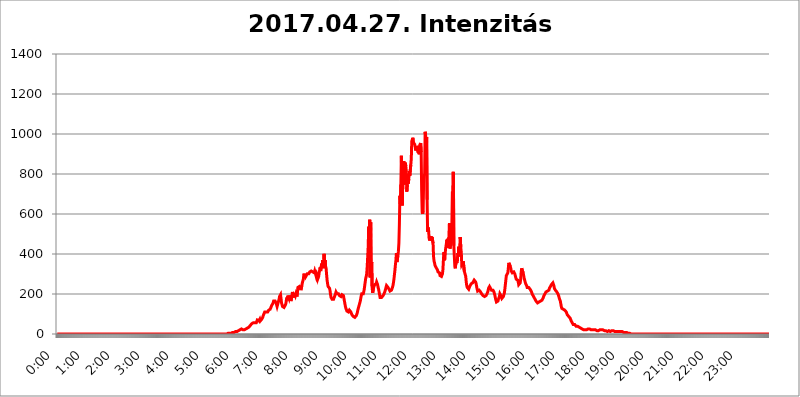
| Category | 2017.04.27. Intenzitás [W/m^2] |
|---|---|
| 0.0 | 0 |
| 0.0006944444444444445 | 0 |
| 0.001388888888888889 | 0 |
| 0.0020833333333333333 | 0 |
| 0.002777777777777778 | 0 |
| 0.003472222222222222 | 0 |
| 0.004166666666666667 | 0 |
| 0.004861111111111111 | 0 |
| 0.005555555555555556 | 0 |
| 0.0062499999999999995 | 0 |
| 0.006944444444444444 | 0 |
| 0.007638888888888889 | 0 |
| 0.008333333333333333 | 0 |
| 0.009027777777777779 | 0 |
| 0.009722222222222222 | 0 |
| 0.010416666666666666 | 0 |
| 0.011111111111111112 | 0 |
| 0.011805555555555555 | 0 |
| 0.012499999999999999 | 0 |
| 0.013194444444444444 | 0 |
| 0.013888888888888888 | 0 |
| 0.014583333333333332 | 0 |
| 0.015277777777777777 | 0 |
| 0.015972222222222224 | 0 |
| 0.016666666666666666 | 0 |
| 0.017361111111111112 | 0 |
| 0.018055555555555557 | 0 |
| 0.01875 | 0 |
| 0.019444444444444445 | 0 |
| 0.02013888888888889 | 0 |
| 0.020833333333333332 | 0 |
| 0.02152777777777778 | 0 |
| 0.022222222222222223 | 0 |
| 0.02291666666666667 | 0 |
| 0.02361111111111111 | 0 |
| 0.024305555555555556 | 0 |
| 0.024999999999999998 | 0 |
| 0.025694444444444447 | 0 |
| 0.02638888888888889 | 0 |
| 0.027083333333333334 | 0 |
| 0.027777777777777776 | 0 |
| 0.02847222222222222 | 0 |
| 0.029166666666666664 | 0 |
| 0.029861111111111113 | 0 |
| 0.030555555555555555 | 0 |
| 0.03125 | 0 |
| 0.03194444444444445 | 0 |
| 0.03263888888888889 | 0 |
| 0.03333333333333333 | 0 |
| 0.034027777777777775 | 0 |
| 0.034722222222222224 | 0 |
| 0.035416666666666666 | 0 |
| 0.036111111111111115 | 0 |
| 0.03680555555555556 | 0 |
| 0.0375 | 0 |
| 0.03819444444444444 | 0 |
| 0.03888888888888889 | 0 |
| 0.03958333333333333 | 0 |
| 0.04027777777777778 | 0 |
| 0.04097222222222222 | 0 |
| 0.041666666666666664 | 0 |
| 0.042361111111111106 | 0 |
| 0.04305555555555556 | 0 |
| 0.043750000000000004 | 0 |
| 0.044444444444444446 | 0 |
| 0.04513888888888889 | 0 |
| 0.04583333333333334 | 0 |
| 0.04652777777777778 | 0 |
| 0.04722222222222222 | 0 |
| 0.04791666666666666 | 0 |
| 0.04861111111111111 | 0 |
| 0.049305555555555554 | 0 |
| 0.049999999999999996 | 0 |
| 0.05069444444444445 | 0 |
| 0.051388888888888894 | 0 |
| 0.052083333333333336 | 0 |
| 0.05277777777777778 | 0 |
| 0.05347222222222222 | 0 |
| 0.05416666666666667 | 0 |
| 0.05486111111111111 | 0 |
| 0.05555555555555555 | 0 |
| 0.05625 | 0 |
| 0.05694444444444444 | 0 |
| 0.057638888888888885 | 0 |
| 0.05833333333333333 | 0 |
| 0.05902777777777778 | 0 |
| 0.059722222222222225 | 0 |
| 0.06041666666666667 | 0 |
| 0.061111111111111116 | 0 |
| 0.06180555555555556 | 0 |
| 0.0625 | 0 |
| 0.06319444444444444 | 0 |
| 0.06388888888888888 | 0 |
| 0.06458333333333334 | 0 |
| 0.06527777777777778 | 0 |
| 0.06597222222222222 | 0 |
| 0.06666666666666667 | 0 |
| 0.06736111111111111 | 0 |
| 0.06805555555555555 | 0 |
| 0.06874999999999999 | 0 |
| 0.06944444444444443 | 0 |
| 0.07013888888888889 | 0 |
| 0.07083333333333333 | 0 |
| 0.07152777777777779 | 0 |
| 0.07222222222222223 | 0 |
| 0.07291666666666667 | 0 |
| 0.07361111111111111 | 0 |
| 0.07430555555555556 | 0 |
| 0.075 | 0 |
| 0.07569444444444444 | 0 |
| 0.0763888888888889 | 0 |
| 0.07708333333333334 | 0 |
| 0.07777777777777778 | 0 |
| 0.07847222222222222 | 0 |
| 0.07916666666666666 | 0 |
| 0.0798611111111111 | 0 |
| 0.08055555555555556 | 0 |
| 0.08125 | 0 |
| 0.08194444444444444 | 0 |
| 0.08263888888888889 | 0 |
| 0.08333333333333333 | 0 |
| 0.08402777777777777 | 0 |
| 0.08472222222222221 | 0 |
| 0.08541666666666665 | 0 |
| 0.08611111111111112 | 0 |
| 0.08680555555555557 | 0 |
| 0.08750000000000001 | 0 |
| 0.08819444444444445 | 0 |
| 0.08888888888888889 | 0 |
| 0.08958333333333333 | 0 |
| 0.09027777777777778 | 0 |
| 0.09097222222222222 | 0 |
| 0.09166666666666667 | 0 |
| 0.09236111111111112 | 0 |
| 0.09305555555555556 | 0 |
| 0.09375 | 0 |
| 0.09444444444444444 | 0 |
| 0.09513888888888888 | 0 |
| 0.09583333333333333 | 0 |
| 0.09652777777777777 | 0 |
| 0.09722222222222222 | 0 |
| 0.09791666666666667 | 0 |
| 0.09861111111111111 | 0 |
| 0.09930555555555555 | 0 |
| 0.09999999999999999 | 0 |
| 0.10069444444444443 | 0 |
| 0.1013888888888889 | 0 |
| 0.10208333333333335 | 0 |
| 0.10277777777777779 | 0 |
| 0.10347222222222223 | 0 |
| 0.10416666666666667 | 0 |
| 0.10486111111111111 | 0 |
| 0.10555555555555556 | 0 |
| 0.10625 | 0 |
| 0.10694444444444444 | 0 |
| 0.1076388888888889 | 0 |
| 0.10833333333333334 | 0 |
| 0.10902777777777778 | 0 |
| 0.10972222222222222 | 0 |
| 0.1111111111111111 | 0 |
| 0.11180555555555556 | 0 |
| 0.11180555555555556 | 0 |
| 0.1125 | 0 |
| 0.11319444444444444 | 0 |
| 0.11388888888888889 | 0 |
| 0.11458333333333333 | 0 |
| 0.11527777777777777 | 0 |
| 0.11597222222222221 | 0 |
| 0.11666666666666665 | 0 |
| 0.1173611111111111 | 0 |
| 0.11805555555555557 | 0 |
| 0.11944444444444445 | 0 |
| 0.12013888888888889 | 0 |
| 0.12083333333333333 | 0 |
| 0.12152777777777778 | 0 |
| 0.12222222222222223 | 0 |
| 0.12291666666666667 | 0 |
| 0.12291666666666667 | 0 |
| 0.12361111111111112 | 0 |
| 0.12430555555555556 | 0 |
| 0.125 | 0 |
| 0.12569444444444444 | 0 |
| 0.12638888888888888 | 0 |
| 0.12708333333333333 | 0 |
| 0.16875 | 0 |
| 0.12847222222222224 | 0 |
| 0.12916666666666668 | 0 |
| 0.12986111111111112 | 0 |
| 0.13055555555555556 | 0 |
| 0.13125 | 0 |
| 0.13194444444444445 | 0 |
| 0.1326388888888889 | 0 |
| 0.13333333333333333 | 0 |
| 0.13402777777777777 | 0 |
| 0.13402777777777777 | 0 |
| 0.13472222222222222 | 0 |
| 0.13541666666666666 | 0 |
| 0.1361111111111111 | 0 |
| 0.13749999999999998 | 0 |
| 0.13819444444444443 | 0 |
| 0.1388888888888889 | 0 |
| 0.13958333333333334 | 0 |
| 0.14027777777777778 | 0 |
| 0.14097222222222222 | 0 |
| 0.14166666666666666 | 0 |
| 0.1423611111111111 | 0 |
| 0.14305555555555557 | 0 |
| 0.14375000000000002 | 0 |
| 0.14444444444444446 | 0 |
| 0.1451388888888889 | 0 |
| 0.1451388888888889 | 0 |
| 0.14652777777777778 | 0 |
| 0.14722222222222223 | 0 |
| 0.14791666666666667 | 0 |
| 0.1486111111111111 | 0 |
| 0.14930555555555555 | 0 |
| 0.15 | 0 |
| 0.15069444444444444 | 0 |
| 0.15138888888888888 | 0 |
| 0.15208333333333332 | 0 |
| 0.15277777777777776 | 0 |
| 0.15347222222222223 | 0 |
| 0.15416666666666667 | 0 |
| 0.15486111111111112 | 0 |
| 0.15555555555555556 | 0 |
| 0.15625 | 0 |
| 0.15694444444444444 | 0 |
| 0.15763888888888888 | 0 |
| 0.15833333333333333 | 0 |
| 0.15902777777777777 | 0 |
| 0.15972222222222224 | 0 |
| 0.16041666666666668 | 0 |
| 0.16111111111111112 | 0 |
| 0.16180555555555556 | 0 |
| 0.1625 | 0 |
| 0.16319444444444445 | 0 |
| 0.1638888888888889 | 0 |
| 0.16458333333333333 | 0 |
| 0.16527777777777777 | 0 |
| 0.16597222222222222 | 0 |
| 0.16666666666666666 | 0 |
| 0.1673611111111111 | 0 |
| 0.16805555555555554 | 0 |
| 0.16874999999999998 | 0 |
| 0.16944444444444443 | 0 |
| 0.17013888888888887 | 0 |
| 0.1708333333333333 | 0 |
| 0.17152777777777775 | 0 |
| 0.17222222222222225 | 0 |
| 0.1729166666666667 | 0 |
| 0.17361111111111113 | 0 |
| 0.17430555555555557 | 0 |
| 0.17500000000000002 | 0 |
| 0.17569444444444446 | 0 |
| 0.1763888888888889 | 0 |
| 0.17708333333333334 | 0 |
| 0.17777777777777778 | 0 |
| 0.17847222222222223 | 0 |
| 0.17916666666666667 | 0 |
| 0.1798611111111111 | 0 |
| 0.18055555555555555 | 0 |
| 0.18125 | 0 |
| 0.18194444444444444 | 0 |
| 0.1826388888888889 | 0 |
| 0.18333333333333335 | 0 |
| 0.1840277777777778 | 0 |
| 0.18472222222222223 | 0 |
| 0.18541666666666667 | 0 |
| 0.18611111111111112 | 0 |
| 0.18680555555555556 | 0 |
| 0.1875 | 0 |
| 0.18819444444444444 | 0 |
| 0.18888888888888888 | 0 |
| 0.18958333333333333 | 0 |
| 0.19027777777777777 | 0 |
| 0.1909722222222222 | 0 |
| 0.19166666666666665 | 0 |
| 0.19236111111111112 | 0 |
| 0.19305555555555554 | 0 |
| 0.19375 | 0 |
| 0.19444444444444445 | 0 |
| 0.1951388888888889 | 0 |
| 0.19583333333333333 | 0 |
| 0.19652777777777777 | 0 |
| 0.19722222222222222 | 0 |
| 0.19791666666666666 | 0 |
| 0.1986111111111111 | 0 |
| 0.19930555555555554 | 0 |
| 0.19999999999999998 | 0 |
| 0.20069444444444443 | 0 |
| 0.20138888888888887 | 0 |
| 0.2020833333333333 | 0 |
| 0.2027777777777778 | 0 |
| 0.2034722222222222 | 0 |
| 0.2041666666666667 | 0 |
| 0.20486111111111113 | 0 |
| 0.20555555555555557 | 0 |
| 0.20625000000000002 | 0 |
| 0.20694444444444446 | 0 |
| 0.2076388888888889 | 0 |
| 0.20833333333333334 | 0 |
| 0.20902777777777778 | 0 |
| 0.20972222222222223 | 0 |
| 0.21041666666666667 | 0 |
| 0.2111111111111111 | 0 |
| 0.21180555555555555 | 0 |
| 0.2125 | 0 |
| 0.21319444444444444 | 0 |
| 0.2138888888888889 | 0 |
| 0.21458333333333335 | 0 |
| 0.2152777777777778 | 0 |
| 0.21597222222222223 | 0 |
| 0.21666666666666667 | 0 |
| 0.21736111111111112 | 0 |
| 0.21805555555555556 | 0 |
| 0.21875 | 0 |
| 0.21944444444444444 | 0 |
| 0.22013888888888888 | 0 |
| 0.22083333333333333 | 0 |
| 0.22152777777777777 | 0 |
| 0.2222222222222222 | 0 |
| 0.22291666666666665 | 0 |
| 0.2236111111111111 | 0 |
| 0.22430555555555556 | 0 |
| 0.225 | 0 |
| 0.22569444444444445 | 0 |
| 0.2263888888888889 | 0 |
| 0.22708333333333333 | 0 |
| 0.22777777777777777 | 0 |
| 0.22847222222222222 | 0 |
| 0.22916666666666666 | 0 |
| 0.2298611111111111 | 0 |
| 0.23055555555555554 | 0 |
| 0.23124999999999998 | 0 |
| 0.23194444444444443 | 0 |
| 0.23263888888888887 | 0 |
| 0.2333333333333333 | 0 |
| 0.2340277777777778 | 0 |
| 0.2347222222222222 | 0 |
| 0.2354166666666667 | 0 |
| 0.23611111111111113 | 0 |
| 0.23680555555555557 | 0 |
| 0.23750000000000002 | 0 |
| 0.23819444444444446 | 3.525 |
| 0.2388888888888889 | 3.525 |
| 0.23958333333333334 | 3.525 |
| 0.24027777777777778 | 3.525 |
| 0.24097222222222223 | 3.525 |
| 0.24166666666666667 | 3.525 |
| 0.2423611111111111 | 3.525 |
| 0.24305555555555555 | 3.525 |
| 0.24375 | 3.525 |
| 0.24444444444444446 | 3.525 |
| 0.24513888888888888 | 7.887 |
| 0.24583333333333335 | 7.887 |
| 0.2465277777777778 | 7.887 |
| 0.24722222222222223 | 7.887 |
| 0.24791666666666667 | 7.887 |
| 0.24861111111111112 | 7.887 |
| 0.24930555555555556 | 12.257 |
| 0.25 | 12.257 |
| 0.25069444444444444 | 12.257 |
| 0.2513888888888889 | 12.257 |
| 0.2520833333333333 | 12.257 |
| 0.25277777777777777 | 12.257 |
| 0.2534722222222222 | 16.636 |
| 0.25416666666666665 | 16.636 |
| 0.2548611111111111 | 21.024 |
| 0.2555555555555556 | 21.024 |
| 0.25625000000000003 | 21.024 |
| 0.2569444444444445 | 25.419 |
| 0.2576388888888889 | 25.419 |
| 0.25833333333333336 | 25.419 |
| 0.2590277777777778 | 25.419 |
| 0.25972222222222224 | 21.024 |
| 0.2604166666666667 | 21.024 |
| 0.2611111111111111 | 21.024 |
| 0.26180555555555557 | 21.024 |
| 0.2625 | 21.024 |
| 0.26319444444444445 | 25.419 |
| 0.2638888888888889 | 25.419 |
| 0.26458333333333334 | 25.419 |
| 0.2652777777777778 | 25.419 |
| 0.2659722222222222 | 29.823 |
| 0.26666666666666666 | 29.823 |
| 0.2673611111111111 | 29.823 |
| 0.26805555555555555 | 34.234 |
| 0.26875 | 34.234 |
| 0.26944444444444443 | 38.653 |
| 0.2701388888888889 | 38.653 |
| 0.2708333333333333 | 43.079 |
| 0.27152777777777776 | 47.511 |
| 0.2722222222222222 | 47.511 |
| 0.27291666666666664 | 51.951 |
| 0.2736111111111111 | 56.398 |
| 0.2743055555555555 | 56.398 |
| 0.27499999999999997 | 56.398 |
| 0.27569444444444446 | 56.398 |
| 0.27638888888888885 | 56.398 |
| 0.27708333333333335 | 56.398 |
| 0.2777777777777778 | 56.398 |
| 0.27847222222222223 | 56.398 |
| 0.2791666666666667 | 56.398 |
| 0.2798611111111111 | 56.398 |
| 0.28055555555555556 | 69.775 |
| 0.28125 | 69.775 |
| 0.28194444444444444 | 74.246 |
| 0.2826388888888889 | 65.31 |
| 0.2833333333333333 | 69.775 |
| 0.28402777777777777 | 74.246 |
| 0.2847222222222222 | 65.31 |
| 0.28541666666666665 | 69.775 |
| 0.28611111111111115 | 69.775 |
| 0.28680555555555554 | 74.246 |
| 0.28750000000000003 | 78.722 |
| 0.2881944444444445 | 83.205 |
| 0.2888888888888889 | 92.184 |
| 0.28958333333333336 | 92.184 |
| 0.2902777777777778 | 92.184 |
| 0.29097222222222224 | 110.201 |
| 0.2916666666666667 | 110.201 |
| 0.2923611111111111 | 110.201 |
| 0.29305555555555557 | 110.201 |
| 0.29375 | 114.716 |
| 0.29444444444444445 | 114.716 |
| 0.2951388888888889 | 110.201 |
| 0.29583333333333334 | 114.716 |
| 0.2965277777777778 | 119.235 |
| 0.2972222222222222 | 119.235 |
| 0.29791666666666666 | 119.235 |
| 0.2986111111111111 | 123.758 |
| 0.29930555555555555 | 128.284 |
| 0.3 | 128.284 |
| 0.30069444444444443 | 141.884 |
| 0.3013888888888889 | 146.423 |
| 0.3020833333333333 | 146.423 |
| 0.30277777777777776 | 155.509 |
| 0.3034722222222222 | 164.605 |
| 0.30416666666666664 | 169.156 |
| 0.3048611111111111 | 160.056 |
| 0.3055555555555555 | 164.605 |
| 0.30624999999999997 | 160.056 |
| 0.3069444444444444 | 155.509 |
| 0.3076388888888889 | 150.964 |
| 0.30833333333333335 | 137.347 |
| 0.3090277777777778 | 141.884 |
| 0.30972222222222223 | 155.509 |
| 0.3104166666666667 | 164.605 |
| 0.3111111111111111 | 173.709 |
| 0.31180555555555556 | 187.378 |
| 0.3125 | 182.82 |
| 0.31319444444444444 | 196.497 |
| 0.3138888888888889 | 191.937 |
| 0.3145833333333333 | 155.509 |
| 0.31527777777777777 | 146.423 |
| 0.3159722222222222 | 137.347 |
| 0.31666666666666665 | 132.814 |
| 0.31736111111111115 | 132.814 |
| 0.31805555555555554 | 132.814 |
| 0.31875000000000003 | 137.347 |
| 0.3194444444444445 | 137.347 |
| 0.3201388888888889 | 146.423 |
| 0.32083333333333336 | 155.509 |
| 0.3215277777777778 | 173.709 |
| 0.32222222222222224 | 182.82 |
| 0.3229166666666667 | 169.156 |
| 0.3236111111111111 | 191.937 |
| 0.32430555555555557 | 187.378 |
| 0.325 | 178.264 |
| 0.32569444444444445 | 191.937 |
| 0.3263888888888889 | 182.82 |
| 0.32708333333333334 | 178.264 |
| 0.3277777777777778 | 164.605 |
| 0.3284722222222222 | 169.156 |
| 0.32916666666666666 | 191.937 |
| 0.3298611111111111 | 210.182 |
| 0.33055555555555555 | 210.182 |
| 0.33125 | 210.182 |
| 0.33194444444444443 | 182.82 |
| 0.3326388888888889 | 205.62 |
| 0.3333333333333333 | 201.058 |
| 0.3340277777777778 | 191.937 |
| 0.3347222222222222 | 201.058 |
| 0.3354166666666667 | 201.058 |
| 0.3361111111111111 | 187.378 |
| 0.3368055555555556 | 210.182 |
| 0.33749999999999997 | 233 |
| 0.33819444444444446 | 233 |
| 0.33888888888888885 | 237.564 |
| 0.33958333333333335 | 237.564 |
| 0.34027777777777773 | 237.564 |
| 0.34097222222222223 | 228.436 |
| 0.3416666666666666 | 219.309 |
| 0.3423611111111111 | 223.873 |
| 0.3430555555555555 | 242.127 |
| 0.34375 | 255.813 |
| 0.3444444444444445 | 264.932 |
| 0.3451388888888889 | 274.047 |
| 0.3458333333333334 | 296.808 |
| 0.34652777777777777 | 301.354 |
| 0.34722222222222227 | 296.808 |
| 0.34791666666666665 | 296.808 |
| 0.34861111111111115 | 287.709 |
| 0.34930555555555554 | 287.709 |
| 0.35000000000000003 | 292.259 |
| 0.3506944444444444 | 301.354 |
| 0.3513888888888889 | 301.354 |
| 0.3520833333333333 | 296.808 |
| 0.3527777777777778 | 301.354 |
| 0.3534722222222222 | 305.898 |
| 0.3541666666666667 | 310.44 |
| 0.3548611111111111 | 310.44 |
| 0.35555555555555557 | 314.98 |
| 0.35625 | 314.98 |
| 0.35694444444444445 | 310.44 |
| 0.3576388888888889 | 319.517 |
| 0.35833333333333334 | 310.44 |
| 0.3590277777777778 | 305.898 |
| 0.3597222222222222 | 310.44 |
| 0.36041666666666666 | 305.898 |
| 0.3611111111111111 | 314.98 |
| 0.36180555555555555 | 314.98 |
| 0.3625 | 314.98 |
| 0.36319444444444443 | 287.709 |
| 0.3638888888888889 | 296.808 |
| 0.3645833333333333 | 287.709 |
| 0.3652777777777778 | 274.047 |
| 0.3659722222222222 | 269.49 |
| 0.3666666666666667 | 287.709 |
| 0.3673611111111111 | 305.898 |
| 0.3680555555555556 | 310.44 |
| 0.36874999999999997 | 333.113 |
| 0.36944444444444446 | 314.98 |
| 0.37013888888888885 | 310.44 |
| 0.37083333333333335 | 351.198 |
| 0.37152777777777773 | 342.162 |
| 0.37222222222222223 | 369.23 |
| 0.3729166666666666 | 351.198 |
| 0.3736111111111111 | 328.584 |
| 0.3743055555555555 | 400.638 |
| 0.375 | 351.198 |
| 0.3756944444444445 | 369.23 |
| 0.3763888888888889 | 337.639 |
| 0.3770833333333334 | 328.584 |
| 0.37777777777777777 | 296.808 |
| 0.37847222222222227 | 269.49 |
| 0.37916666666666665 | 251.251 |
| 0.37986111111111115 | 237.564 |
| 0.38055555555555554 | 233 |
| 0.38125000000000003 | 233 |
| 0.3819444444444444 | 228.436 |
| 0.3826388888888889 | 214.746 |
| 0.3833333333333333 | 196.497 |
| 0.3840277777777778 | 182.82 |
| 0.3847222222222222 | 178.264 |
| 0.3854166666666667 | 173.709 |
| 0.3861111111111111 | 178.264 |
| 0.38680555555555557 | 178.264 |
| 0.3875 | 173.709 |
| 0.38819444444444445 | 178.264 |
| 0.3888888888888889 | 187.378 |
| 0.38958333333333334 | 191.937 |
| 0.3902777777777778 | 201.058 |
| 0.3909722222222222 | 210.182 |
| 0.39166666666666666 | 210.182 |
| 0.3923611111111111 | 201.058 |
| 0.39305555555555555 | 196.497 |
| 0.39375 | 196.497 |
| 0.39444444444444443 | 201.058 |
| 0.3951388888888889 | 201.058 |
| 0.3958333333333333 | 191.937 |
| 0.3965277777777778 | 187.378 |
| 0.3972222222222222 | 187.378 |
| 0.3979166666666667 | 187.378 |
| 0.3986111111111111 | 191.937 |
| 0.3993055555555556 | 196.497 |
| 0.39999999999999997 | 201.058 |
| 0.40069444444444446 | 196.497 |
| 0.40138888888888885 | 191.937 |
| 0.40208333333333335 | 178.264 |
| 0.40277777777777773 | 164.605 |
| 0.40347222222222223 | 150.964 |
| 0.4041666666666666 | 137.347 |
| 0.4048611111111111 | 128.284 |
| 0.4055555555555555 | 123.758 |
| 0.40625 | 114.716 |
| 0.4069444444444445 | 110.201 |
| 0.4076388888888889 | 110.201 |
| 0.4083333333333334 | 110.201 |
| 0.40902777777777777 | 114.716 |
| 0.40972222222222227 | 119.235 |
| 0.41041666666666665 | 123.758 |
| 0.41111111111111115 | 119.235 |
| 0.41180555555555554 | 110.201 |
| 0.41250000000000003 | 105.69 |
| 0.4131944444444444 | 96.682 |
| 0.4138888888888889 | 96.682 |
| 0.4145833333333333 | 92.184 |
| 0.4152777777777778 | 87.692 |
| 0.4159722222222222 | 87.692 |
| 0.4166666666666667 | 83.205 |
| 0.4173611111111111 | 83.205 |
| 0.41805555555555557 | 83.205 |
| 0.41875 | 87.692 |
| 0.41944444444444445 | 92.184 |
| 0.4201388888888889 | 96.682 |
| 0.42083333333333334 | 105.69 |
| 0.4215277777777778 | 119.235 |
| 0.4222222222222222 | 128.284 |
| 0.42291666666666666 | 137.347 |
| 0.4236111111111111 | 146.423 |
| 0.42430555555555555 | 155.509 |
| 0.425 | 164.605 |
| 0.42569444444444443 | 178.264 |
| 0.4263888888888889 | 191.937 |
| 0.4270833333333333 | 201.058 |
| 0.4277777777777778 | 201.058 |
| 0.4284722222222222 | 196.497 |
| 0.4291666666666667 | 201.058 |
| 0.4298611111111111 | 210.182 |
| 0.4305555555555556 | 223.873 |
| 0.43124999999999997 | 242.127 |
| 0.43194444444444446 | 260.373 |
| 0.43263888888888885 | 278.603 |
| 0.43333333333333335 | 287.709 |
| 0.43402777777777773 | 301.354 |
| 0.43472222222222223 | 337.639 |
| 0.4354166666666666 | 333.113 |
| 0.4361111111111111 | 436.27 |
| 0.4368055555555555 | 536.82 |
| 0.4375 | 414.035 |
| 0.4381944444444445 | 571.049 |
| 0.4388888888888889 | 283.156 |
| 0.4395833333333334 | 558.261 |
| 0.44027777777777777 | 314.98 |
| 0.44097222222222227 | 360.221 |
| 0.44166666666666665 | 233 |
| 0.44236111111111115 | 205.62 |
| 0.44305555555555554 | 210.182 |
| 0.44375000000000003 | 233 |
| 0.4444444444444444 | 233 |
| 0.4451388888888889 | 246.689 |
| 0.4458333333333333 | 251.251 |
| 0.4465277777777778 | 246.689 |
| 0.4472222222222222 | 251.251 |
| 0.4479166666666667 | 260.373 |
| 0.4486111111111111 | 260.373 |
| 0.44930555555555557 | 246.689 |
| 0.45 | 233 |
| 0.45069444444444445 | 223.873 |
| 0.4513888888888889 | 210.182 |
| 0.45208333333333334 | 196.497 |
| 0.4527777777777778 | 182.82 |
| 0.4534722222222222 | 182.82 |
| 0.45416666666666666 | 182.82 |
| 0.4548611111111111 | 182.82 |
| 0.45555555555555555 | 187.378 |
| 0.45625 | 187.378 |
| 0.45694444444444443 | 191.937 |
| 0.4576388888888889 | 196.497 |
| 0.4583333333333333 | 201.058 |
| 0.4590277777777778 | 205.62 |
| 0.4597222222222222 | 214.746 |
| 0.4604166666666667 | 219.309 |
| 0.4611111111111111 | 233 |
| 0.4618055555555556 | 242.127 |
| 0.46249999999999997 | 242.127 |
| 0.46319444444444446 | 237.564 |
| 0.46388888888888885 | 233 |
| 0.46458333333333335 | 228.436 |
| 0.46527777777777773 | 223.873 |
| 0.46597222222222223 | 219.309 |
| 0.4666666666666666 | 214.746 |
| 0.4673611111111111 | 214.746 |
| 0.4680555555555555 | 214.746 |
| 0.46875 | 219.309 |
| 0.4694444444444445 | 223.873 |
| 0.4701388888888889 | 233 |
| 0.4708333333333334 | 242.127 |
| 0.47152777777777777 | 255.813 |
| 0.47222222222222227 | 274.047 |
| 0.47291666666666665 | 296.808 |
| 0.47361111111111115 | 319.517 |
| 0.47430555555555554 | 346.682 |
| 0.47500000000000003 | 369.23 |
| 0.4756944444444444 | 405.108 |
| 0.4763888888888889 | 360.221 |
| 0.4770833333333333 | 364.728 |
| 0.4777777777777778 | 391.685 |
| 0.4784722222222222 | 414.035 |
| 0.4791666666666667 | 453.968 |
| 0.4798611111111111 | 549.704 |
| 0.48055555555555557 | 691.608 |
| 0.48125 | 650.667 |
| 0.48194444444444445 | 747.834 |
| 0.4826388888888889 | 891.099 |
| 0.48333333333333334 | 723.889 |
| 0.4840277777777778 | 642.4 |
| 0.4847222222222222 | 791.169 |
| 0.48541666666666666 | 751.803 |
| 0.4861111111111111 | 864.493 |
| 0.48680555555555555 | 747.834 |
| 0.4875 | 841.526 |
| 0.48819444444444443 | 856.855 |
| 0.4888888888888889 | 837.682 |
| 0.4895833333333333 | 814.519 |
| 0.4902777777777778 | 711.832 |
| 0.4909722222222222 | 747.834 |
| 0.4916666666666667 | 767.62 |
| 0.4923611111111111 | 751.803 |
| 0.4930555555555556 | 775.492 |
| 0.49374999999999997 | 814.519 |
| 0.49444444444444446 | 791.169 |
| 0.49513888888888885 | 791.169 |
| 0.49583333333333335 | 845.365 |
| 0.49652777777777773 | 875.918 |
| 0.49722222222222223 | 962.555 |
| 0.4979166666666666 | 962.555 |
| 0.4986111111111111 | 981.244 |
| 0.4993055555555555 | 966.295 |
| 0.5 | 955.071 |
| 0.5006944444444444 | 951.327 |
| 0.5013888888888889 | 947.58 |
| 0.5020833333333333 | 947.58 |
| 0.5027777777777778 | 917.534 |
| 0.5034722222222222 | 940.082 |
| 0.5041666666666667 | 943.832 |
| 0.5048611111111111 | 943.832 |
| 0.5055555555555555 | 917.534 |
| 0.50625 | 906.223 |
| 0.5069444444444444 | 928.819 |
| 0.5076388888888889 | 898.668 |
| 0.5083333333333333 | 943.832 |
| 0.5090277777777777 | 940.082 |
| 0.5097222222222222 | 955.071 |
| 0.5104166666666666 | 909.996 |
| 0.5111111111111112 | 715.858 |
| 0.5118055555555555 | 609.062 |
| 0.5125000000000001 | 600.661 |
| 0.5131944444444444 | 617.436 |
| 0.513888888888889 | 771.559 |
| 0.5145833333333333 | 791.169 |
| 0.5152777777777778 | 798.974 |
| 0.5159722222222222 | 1011.118 |
| 0.5166666666666667 | 992.448 |
| 0.517361111111111 | 829.981 |
| 0.5180555555555556 | 984.98 |
| 0.5187499999999999 | 671.22 |
| 0.5194444444444445 | 510.885 |
| 0.5201388888888888 | 532.513 |
| 0.5208333333333334 | 519.555 |
| 0.5215277777777778 | 480.356 |
| 0.5222222222222223 | 467.187 |
| 0.5229166666666667 | 475.972 |
| 0.5236111111111111 | 480.356 |
| 0.5243055555555556 | 489.108 |
| 0.525 | 471.582 |
| 0.5256944444444445 | 484.735 |
| 0.5263888888888889 | 480.356 |
| 0.5270833333333333 | 453.968 |
| 0.5277777777777778 | 387.202 |
| 0.5284722222222222 | 364.728 |
| 0.5291666666666667 | 355.712 |
| 0.5298611111111111 | 342.162 |
| 0.5305555555555556 | 337.639 |
| 0.53125 | 333.113 |
| 0.5319444444444444 | 328.584 |
| 0.5326388888888889 | 333.113 |
| 0.5333333333333333 | 319.517 |
| 0.5340277777777778 | 310.44 |
| 0.5347222222222222 | 305.898 |
| 0.5354166666666667 | 305.898 |
| 0.5361111111111111 | 305.898 |
| 0.5368055555555555 | 292.259 |
| 0.5375 | 287.709 |
| 0.5381944444444444 | 287.709 |
| 0.5388888888888889 | 287.709 |
| 0.5395833333333333 | 287.709 |
| 0.5402777777777777 | 301.354 |
| 0.5409722222222222 | 324.052 |
| 0.5416666666666666 | 373.729 |
| 0.5423611111111112 | 409.574 |
| 0.5430555555555555 | 369.23 |
| 0.5437500000000001 | 378.224 |
| 0.5444444444444444 | 418.492 |
| 0.545138888888889 | 418.492 |
| 0.5458333333333333 | 422.943 |
| 0.5465277777777778 | 471.582 |
| 0.5472222222222222 | 445.129 |
| 0.5479166666666667 | 475.972 |
| 0.548611111111111 | 431.833 |
| 0.5493055555555556 | 484.735 |
| 0.5499999999999999 | 553.986 |
| 0.5506944444444445 | 427.39 |
| 0.5513888888888888 | 422.943 |
| 0.5520833333333334 | 427.39 |
| 0.5527777777777778 | 462.786 |
| 0.5534722222222223 | 549.704 |
| 0.5541666666666667 | 711.832 |
| 0.5548611111111111 | 663.019 |
| 0.5555555555555556 | 810.641 |
| 0.55625 | 440.702 |
| 0.5569444444444445 | 387.202 |
| 0.5576388888888889 | 337.639 |
| 0.5583333333333333 | 328.584 |
| 0.5590277777777778 | 355.712 |
| 0.5597222222222222 | 355.712 |
| 0.5604166666666667 | 351.198 |
| 0.5611111111111111 | 360.221 |
| 0.5618055555555556 | 405.108 |
| 0.5625 | 391.685 |
| 0.5631944444444444 | 436.27 |
| 0.5638888888888889 | 405.108 |
| 0.5645833333333333 | 387.202 |
| 0.5652777777777778 | 484.735 |
| 0.5659722222222222 | 431.833 |
| 0.5666666666666667 | 409.574 |
| 0.5673611111111111 | 346.682 |
| 0.5680555555555555 | 342.162 |
| 0.56875 | 355.712 |
| 0.5694444444444444 | 364.728 |
| 0.5701388888888889 | 369.23 |
| 0.5708333333333333 | 314.98 |
| 0.5715277777777777 | 319.517 |
| 0.5722222222222222 | 319.517 |
| 0.5729166666666666 | 287.709 |
| 0.5736111111111112 | 260.373 |
| 0.5743055555555555 | 242.127 |
| 0.5750000000000001 | 233 |
| 0.5756944444444444 | 228.436 |
| 0.576388888888889 | 228.436 |
| 0.5770833333333333 | 223.873 |
| 0.5777777777777778 | 228.436 |
| 0.5784722222222222 | 237.564 |
| 0.5791666666666667 | 242.127 |
| 0.579861111111111 | 242.127 |
| 0.5805555555555556 | 251.251 |
| 0.5812499999999999 | 255.813 |
| 0.5819444444444445 | 255.813 |
| 0.5826388888888888 | 255.813 |
| 0.5833333333333334 | 260.373 |
| 0.5840277777777778 | 260.373 |
| 0.5847222222222223 | 269.49 |
| 0.5854166666666667 | 269.49 |
| 0.5861111111111111 | 264.932 |
| 0.5868055555555556 | 260.373 |
| 0.5875 | 251.251 |
| 0.5881944444444445 | 237.564 |
| 0.5888888888888889 | 223.873 |
| 0.5895833333333333 | 214.746 |
| 0.5902777777777778 | 210.182 |
| 0.5909722222222222 | 210.182 |
| 0.5916666666666667 | 219.309 |
| 0.5923611111111111 | 219.309 |
| 0.5930555555555556 | 214.746 |
| 0.59375 | 210.182 |
| 0.5944444444444444 | 205.62 |
| 0.5951388888888889 | 201.058 |
| 0.5958333333333333 | 196.497 |
| 0.5965277777777778 | 196.497 |
| 0.5972222222222222 | 191.937 |
| 0.5979166666666667 | 187.378 |
| 0.5986111111111111 | 187.378 |
| 0.5993055555555555 | 187.378 |
| 0.6 | 187.378 |
| 0.6006944444444444 | 191.937 |
| 0.6013888888888889 | 191.937 |
| 0.6020833333333333 | 196.497 |
| 0.6027777777777777 | 201.058 |
| 0.6034722222222222 | 205.62 |
| 0.6041666666666666 | 214.746 |
| 0.6048611111111112 | 228.436 |
| 0.6055555555555555 | 233 |
| 0.6062500000000001 | 237.564 |
| 0.6069444444444444 | 233 |
| 0.607638888888889 | 228.436 |
| 0.6083333333333333 | 223.873 |
| 0.6090277777777778 | 219.309 |
| 0.6097222222222222 | 219.309 |
| 0.6104166666666667 | 214.746 |
| 0.611111111111111 | 219.309 |
| 0.6118055555555556 | 219.309 |
| 0.6124999999999999 | 210.182 |
| 0.6131944444444445 | 201.058 |
| 0.6138888888888888 | 191.937 |
| 0.6145833333333334 | 178.264 |
| 0.6152777777777778 | 169.156 |
| 0.6159722222222223 | 160.056 |
| 0.6166666666666667 | 160.056 |
| 0.6173611111111111 | 164.605 |
| 0.6180555555555556 | 164.605 |
| 0.61875 | 173.709 |
| 0.6194444444444445 | 178.264 |
| 0.6201388888888889 | 187.378 |
| 0.6208333333333333 | 201.058 |
| 0.6215277777777778 | 201.058 |
| 0.6222222222222222 | 196.497 |
| 0.6229166666666667 | 187.378 |
| 0.6236111111111111 | 178.264 |
| 0.6243055555555556 | 173.709 |
| 0.625 | 178.264 |
| 0.6256944444444444 | 187.378 |
| 0.6263888888888889 | 196.497 |
| 0.6270833333333333 | 205.62 |
| 0.6277777777777778 | 223.873 |
| 0.6284722222222222 | 246.689 |
| 0.6291666666666667 | 269.49 |
| 0.6298611111111111 | 292.259 |
| 0.6305555555555555 | 296.808 |
| 0.63125 | 296.808 |
| 0.6319444444444444 | 305.898 |
| 0.6326388888888889 | 328.584 |
| 0.6333333333333333 | 355.712 |
| 0.6340277777777777 | 360.221 |
| 0.6347222222222222 | 355.712 |
| 0.6354166666666666 | 337.639 |
| 0.6361111111111112 | 328.584 |
| 0.6368055555555555 | 314.98 |
| 0.6375000000000001 | 310.44 |
| 0.6381944444444444 | 305.898 |
| 0.638888888888889 | 305.898 |
| 0.6395833333333333 | 305.898 |
| 0.6402777777777778 | 310.44 |
| 0.6409722222222222 | 310.44 |
| 0.6416666666666667 | 301.354 |
| 0.642361111111111 | 292.259 |
| 0.6430555555555556 | 283.156 |
| 0.6437499999999999 | 274.047 |
| 0.6444444444444445 | 269.49 |
| 0.6451388888888888 | 269.49 |
| 0.6458333333333334 | 269.49 |
| 0.6465277777777778 | 260.373 |
| 0.6472222222222223 | 246.689 |
| 0.6479166666666667 | 242.127 |
| 0.6486111111111111 | 242.127 |
| 0.6493055555555556 | 255.813 |
| 0.65 | 274.047 |
| 0.6506944444444445 | 310.44 |
| 0.6513888888888889 | 328.584 |
| 0.6520833333333333 | 328.584 |
| 0.6527777777777778 | 328.584 |
| 0.6534722222222222 | 305.898 |
| 0.6541666666666667 | 301.354 |
| 0.6548611111111111 | 278.603 |
| 0.6555555555555556 | 269.49 |
| 0.65625 | 260.373 |
| 0.6569444444444444 | 251.251 |
| 0.6576388888888889 | 246.689 |
| 0.6583333333333333 | 242.127 |
| 0.6590277777777778 | 233 |
| 0.6597222222222222 | 233 |
| 0.6604166666666667 | 233 |
| 0.6611111111111111 | 233 |
| 0.6618055555555555 | 233 |
| 0.6625 | 228.436 |
| 0.6631944444444444 | 223.873 |
| 0.6638888888888889 | 219.309 |
| 0.6645833333333333 | 219.309 |
| 0.6652777777777777 | 210.182 |
| 0.6659722222222222 | 201.058 |
| 0.6666666666666666 | 196.497 |
| 0.6673611111111111 | 191.937 |
| 0.6680555555555556 | 187.378 |
| 0.6687500000000001 | 182.82 |
| 0.6694444444444444 | 178.264 |
| 0.6701388888888888 | 173.709 |
| 0.6708333333333334 | 169.156 |
| 0.6715277777777778 | 164.605 |
| 0.6722222222222222 | 160.056 |
| 0.6729166666666666 | 160.056 |
| 0.6736111111111112 | 155.509 |
| 0.6743055555555556 | 155.509 |
| 0.6749999999999999 | 155.509 |
| 0.6756944444444444 | 160.056 |
| 0.6763888888888889 | 160.056 |
| 0.6770833333333334 | 164.605 |
| 0.6777777777777777 | 164.605 |
| 0.6784722222222223 | 164.605 |
| 0.6791666666666667 | 169.156 |
| 0.6798611111111111 | 169.156 |
| 0.6805555555555555 | 173.709 |
| 0.68125 | 178.264 |
| 0.6819444444444445 | 182.82 |
| 0.6826388888888889 | 191.937 |
| 0.6833333333333332 | 196.497 |
| 0.6840277777777778 | 201.058 |
| 0.6847222222222222 | 205.62 |
| 0.6854166666666667 | 210.182 |
| 0.686111111111111 | 214.746 |
| 0.6868055555555556 | 214.746 |
| 0.6875 | 214.746 |
| 0.6881944444444444 | 214.746 |
| 0.688888888888889 | 219.309 |
| 0.6895833333333333 | 219.309 |
| 0.6902777777777778 | 228.436 |
| 0.6909722222222222 | 228.436 |
| 0.6916666666666668 | 237.564 |
| 0.6923611111111111 | 242.127 |
| 0.6930555555555555 | 246.689 |
| 0.69375 | 251.251 |
| 0.6944444444444445 | 251.251 |
| 0.6951388888888889 | 255.813 |
| 0.6958333333333333 | 251.251 |
| 0.6965277777777777 | 242.127 |
| 0.6972222222222223 | 228.436 |
| 0.6979166666666666 | 223.873 |
| 0.6986111111111111 | 219.309 |
| 0.6993055555555556 | 214.746 |
| 0.7000000000000001 | 214.746 |
| 0.7006944444444444 | 210.182 |
| 0.7013888888888888 | 210.182 |
| 0.7020833333333334 | 205.62 |
| 0.7027777777777778 | 196.497 |
| 0.7034722222222222 | 187.378 |
| 0.7041666666666666 | 178.264 |
| 0.7048611111111112 | 173.709 |
| 0.7055555555555556 | 164.605 |
| 0.7062499999999999 | 150.964 |
| 0.7069444444444444 | 137.347 |
| 0.7076388888888889 | 128.284 |
| 0.7083333333333334 | 123.758 |
| 0.7090277777777777 | 123.758 |
| 0.7097222222222223 | 123.758 |
| 0.7104166666666667 | 123.758 |
| 0.7111111111111111 | 123.758 |
| 0.7118055555555555 | 119.235 |
| 0.7125 | 119.235 |
| 0.7131944444444445 | 114.716 |
| 0.7138888888888889 | 110.201 |
| 0.7145833333333332 | 105.69 |
| 0.7152777777777778 | 96.682 |
| 0.7159722222222222 | 92.184 |
| 0.7166666666666667 | 92.184 |
| 0.717361111111111 | 87.692 |
| 0.7180555555555556 | 87.692 |
| 0.71875 | 83.205 |
| 0.7194444444444444 | 78.722 |
| 0.720138888888889 | 74.246 |
| 0.7208333333333333 | 65.31 |
| 0.7215277777777778 | 60.85 |
| 0.7222222222222222 | 56.398 |
| 0.7229166666666668 | 51.951 |
| 0.7236111111111111 | 47.511 |
| 0.7243055555555555 | 47.511 |
| 0.725 | 47.511 |
| 0.7256944444444445 | 47.511 |
| 0.7263888888888889 | 43.079 |
| 0.7270833333333333 | 43.079 |
| 0.7277777777777777 | 38.653 |
| 0.7284722222222223 | 38.653 |
| 0.7291666666666666 | 38.653 |
| 0.7298611111111111 | 38.653 |
| 0.7305555555555556 | 38.653 |
| 0.7312500000000001 | 38.653 |
| 0.7319444444444444 | 34.234 |
| 0.7326388888888888 | 34.234 |
| 0.7333333333333334 | 29.823 |
| 0.7340277777777778 | 29.823 |
| 0.7347222222222222 | 25.419 |
| 0.7354166666666666 | 25.419 |
| 0.7361111111111112 | 25.419 |
| 0.7368055555555556 | 25.419 |
| 0.7374999999999999 | 21.024 |
| 0.7381944444444444 | 21.024 |
| 0.7388888888888889 | 21.024 |
| 0.7395833333333334 | 21.024 |
| 0.7402777777777777 | 21.024 |
| 0.7409722222222223 | 21.024 |
| 0.7416666666666667 | 25.419 |
| 0.7423611111111111 | 21.024 |
| 0.7430555555555555 | 21.024 |
| 0.74375 | 21.024 |
| 0.7444444444444445 | 25.419 |
| 0.7451388888888889 | 25.419 |
| 0.7458333333333332 | 25.419 |
| 0.7465277777777778 | 25.419 |
| 0.7472222222222222 | 21.024 |
| 0.7479166666666667 | 21.024 |
| 0.748611111111111 | 21.024 |
| 0.7493055555555556 | 21.024 |
| 0.75 | 21.024 |
| 0.7506944444444444 | 21.024 |
| 0.751388888888889 | 21.024 |
| 0.7520833333333333 | 21.024 |
| 0.7527777777777778 | 21.024 |
| 0.7534722222222222 | 21.024 |
| 0.7541666666666668 | 21.024 |
| 0.7548611111111111 | 21.024 |
| 0.7555555555555555 | 21.024 |
| 0.75625 | 21.024 |
| 0.7569444444444445 | 16.636 |
| 0.7576388888888889 | 16.636 |
| 0.7583333333333333 | 16.636 |
| 0.7590277777777777 | 16.636 |
| 0.7597222222222223 | 21.024 |
| 0.7604166666666666 | 21.024 |
| 0.7611111111111111 | 21.024 |
| 0.7618055555555556 | 21.024 |
| 0.7625000000000001 | 21.024 |
| 0.7631944444444444 | 21.024 |
| 0.7638888888888888 | 21.024 |
| 0.7645833333333334 | 21.024 |
| 0.7652777777777778 | 21.024 |
| 0.7659722222222222 | 21.024 |
| 0.7666666666666666 | 21.024 |
| 0.7673611111111112 | 16.636 |
| 0.7680555555555556 | 16.636 |
| 0.7687499999999999 | 16.636 |
| 0.7694444444444444 | 16.636 |
| 0.7701388888888889 | 12.257 |
| 0.7708333333333334 | 12.257 |
| 0.7715277777777777 | 12.257 |
| 0.7722222222222223 | 12.257 |
| 0.7729166666666667 | 16.636 |
| 0.7736111111111111 | 16.636 |
| 0.7743055555555555 | 16.636 |
| 0.775 | 12.257 |
| 0.7756944444444445 | 12.257 |
| 0.7763888888888889 | 12.257 |
| 0.7770833333333332 | 12.257 |
| 0.7777777777777778 | 16.636 |
| 0.7784722222222222 | 16.636 |
| 0.7791666666666667 | 16.636 |
| 0.779861111111111 | 16.636 |
| 0.7805555555555556 | 16.636 |
| 0.78125 | 12.257 |
| 0.7819444444444444 | 12.257 |
| 0.782638888888889 | 12.257 |
| 0.7833333333333333 | 12.257 |
| 0.7840277777777778 | 12.257 |
| 0.7847222222222222 | 12.257 |
| 0.7854166666666668 | 12.257 |
| 0.7861111111111111 | 12.257 |
| 0.7868055555555555 | 12.257 |
| 0.7875 | 12.257 |
| 0.7881944444444445 | 12.257 |
| 0.7888888888888889 | 12.257 |
| 0.7895833333333333 | 12.257 |
| 0.7902777777777777 | 12.257 |
| 0.7909722222222223 | 12.257 |
| 0.7916666666666666 | 12.257 |
| 0.7923611111111111 | 12.257 |
| 0.7930555555555556 | 12.257 |
| 0.7937500000000001 | 7.887 |
| 0.7944444444444444 | 7.887 |
| 0.7951388888888888 | 7.887 |
| 0.7958333333333334 | 7.887 |
| 0.7965277777777778 | 7.887 |
| 0.7972222222222222 | 7.887 |
| 0.7979166666666666 | 7.887 |
| 0.7986111111111112 | 7.887 |
| 0.7993055555555556 | 7.887 |
| 0.7999999999999999 | 3.525 |
| 0.8006944444444444 | 3.525 |
| 0.8013888888888889 | 3.525 |
| 0.8020833333333334 | 3.525 |
| 0.8027777777777777 | 3.525 |
| 0.8034722222222223 | 3.525 |
| 0.8041666666666667 | 3.525 |
| 0.8048611111111111 | 0 |
| 0.8055555555555555 | 0 |
| 0.80625 | 0 |
| 0.8069444444444445 | 0 |
| 0.8076388888888889 | 0 |
| 0.8083333333333332 | 0 |
| 0.8090277777777778 | 0 |
| 0.8097222222222222 | 0 |
| 0.8104166666666667 | 0 |
| 0.811111111111111 | 0 |
| 0.8118055555555556 | 0 |
| 0.8125 | 0 |
| 0.8131944444444444 | 0 |
| 0.813888888888889 | 0 |
| 0.8145833333333333 | 0 |
| 0.8152777777777778 | 0 |
| 0.8159722222222222 | 0 |
| 0.8166666666666668 | 0 |
| 0.8173611111111111 | 0 |
| 0.8180555555555555 | 0 |
| 0.81875 | 0 |
| 0.8194444444444445 | 0 |
| 0.8201388888888889 | 0 |
| 0.8208333333333333 | 0 |
| 0.8215277777777777 | 0 |
| 0.8222222222222223 | 0 |
| 0.8229166666666666 | 0 |
| 0.8236111111111111 | 0 |
| 0.8243055555555556 | 0 |
| 0.8250000000000001 | 0 |
| 0.8256944444444444 | 0 |
| 0.8263888888888888 | 0 |
| 0.8270833333333334 | 0 |
| 0.8277777777777778 | 0 |
| 0.8284722222222222 | 0 |
| 0.8291666666666666 | 0 |
| 0.8298611111111112 | 0 |
| 0.8305555555555556 | 0 |
| 0.8312499999999999 | 0 |
| 0.8319444444444444 | 0 |
| 0.8326388888888889 | 0 |
| 0.8333333333333334 | 0 |
| 0.8340277777777777 | 0 |
| 0.8347222222222223 | 0 |
| 0.8354166666666667 | 0 |
| 0.8361111111111111 | 0 |
| 0.8368055555555555 | 0 |
| 0.8375 | 0 |
| 0.8381944444444445 | 0 |
| 0.8388888888888889 | 0 |
| 0.8395833333333332 | 0 |
| 0.8402777777777778 | 0 |
| 0.8409722222222222 | 0 |
| 0.8416666666666667 | 0 |
| 0.842361111111111 | 0 |
| 0.8430555555555556 | 0 |
| 0.84375 | 0 |
| 0.8444444444444444 | 0 |
| 0.845138888888889 | 0 |
| 0.8458333333333333 | 0 |
| 0.8465277777777778 | 0 |
| 0.8472222222222222 | 0 |
| 0.8479166666666668 | 0 |
| 0.8486111111111111 | 0 |
| 0.8493055555555555 | 0 |
| 0.85 | 0 |
| 0.8506944444444445 | 0 |
| 0.8513888888888889 | 0 |
| 0.8520833333333333 | 0 |
| 0.8527777777777777 | 0 |
| 0.8534722222222223 | 0 |
| 0.8541666666666666 | 0 |
| 0.8548611111111111 | 0 |
| 0.8555555555555556 | 0 |
| 0.8562500000000001 | 0 |
| 0.8569444444444444 | 0 |
| 0.8576388888888888 | 0 |
| 0.8583333333333334 | 0 |
| 0.8590277777777778 | 0 |
| 0.8597222222222222 | 0 |
| 0.8604166666666666 | 0 |
| 0.8611111111111112 | 0 |
| 0.8618055555555556 | 0 |
| 0.8624999999999999 | 0 |
| 0.8631944444444444 | 0 |
| 0.8638888888888889 | 0 |
| 0.8645833333333334 | 0 |
| 0.8652777777777777 | 0 |
| 0.8659722222222223 | 0 |
| 0.8666666666666667 | 0 |
| 0.8673611111111111 | 0 |
| 0.8680555555555555 | 0 |
| 0.86875 | 0 |
| 0.8694444444444445 | 0 |
| 0.8701388888888889 | 0 |
| 0.8708333333333332 | 0 |
| 0.8715277777777778 | 0 |
| 0.8722222222222222 | 0 |
| 0.8729166666666667 | 0 |
| 0.873611111111111 | 0 |
| 0.8743055555555556 | 0 |
| 0.875 | 0 |
| 0.8756944444444444 | 0 |
| 0.876388888888889 | 0 |
| 0.8770833333333333 | 0 |
| 0.8777777777777778 | 0 |
| 0.8784722222222222 | 0 |
| 0.8791666666666668 | 0 |
| 0.8798611111111111 | 0 |
| 0.8805555555555555 | 0 |
| 0.88125 | 0 |
| 0.8819444444444445 | 0 |
| 0.8826388888888889 | 0 |
| 0.8833333333333333 | 0 |
| 0.8840277777777777 | 0 |
| 0.8847222222222223 | 0 |
| 0.8854166666666666 | 0 |
| 0.8861111111111111 | 0 |
| 0.8868055555555556 | 0 |
| 0.8875000000000001 | 0 |
| 0.8881944444444444 | 0 |
| 0.8888888888888888 | 0 |
| 0.8895833333333334 | 0 |
| 0.8902777777777778 | 0 |
| 0.8909722222222222 | 0 |
| 0.8916666666666666 | 0 |
| 0.8923611111111112 | 0 |
| 0.8930555555555556 | 0 |
| 0.8937499999999999 | 0 |
| 0.8944444444444444 | 0 |
| 0.8951388888888889 | 0 |
| 0.8958333333333334 | 0 |
| 0.8965277777777777 | 0 |
| 0.8972222222222223 | 0 |
| 0.8979166666666667 | 0 |
| 0.8986111111111111 | 0 |
| 0.8993055555555555 | 0 |
| 0.9 | 0 |
| 0.9006944444444445 | 0 |
| 0.9013888888888889 | 0 |
| 0.9020833333333332 | 0 |
| 0.9027777777777778 | 0 |
| 0.9034722222222222 | 0 |
| 0.9041666666666667 | 0 |
| 0.904861111111111 | 0 |
| 0.9055555555555556 | 0 |
| 0.90625 | 0 |
| 0.9069444444444444 | 0 |
| 0.907638888888889 | 0 |
| 0.9083333333333333 | 0 |
| 0.9090277777777778 | 0 |
| 0.9097222222222222 | 0 |
| 0.9104166666666668 | 0 |
| 0.9111111111111111 | 0 |
| 0.9118055555555555 | 0 |
| 0.9125 | 0 |
| 0.9131944444444445 | 0 |
| 0.9138888888888889 | 0 |
| 0.9145833333333333 | 0 |
| 0.9152777777777777 | 0 |
| 0.9159722222222223 | 0 |
| 0.9166666666666666 | 0 |
| 0.9173611111111111 | 0 |
| 0.9180555555555556 | 0 |
| 0.9187500000000001 | 0 |
| 0.9194444444444444 | 0 |
| 0.9201388888888888 | 0 |
| 0.9208333333333334 | 0 |
| 0.9215277777777778 | 0 |
| 0.9222222222222222 | 0 |
| 0.9229166666666666 | 0 |
| 0.9236111111111112 | 0 |
| 0.9243055555555556 | 0 |
| 0.9249999999999999 | 0 |
| 0.9256944444444444 | 0 |
| 0.9263888888888889 | 0 |
| 0.9270833333333334 | 0 |
| 0.9277777777777777 | 0 |
| 0.9284722222222223 | 0 |
| 0.9291666666666667 | 0 |
| 0.9298611111111111 | 0 |
| 0.9305555555555555 | 0 |
| 0.93125 | 0 |
| 0.9319444444444445 | 0 |
| 0.9326388888888889 | 0 |
| 0.9333333333333332 | 0 |
| 0.9340277777777778 | 0 |
| 0.9347222222222222 | 0 |
| 0.9354166666666667 | 0 |
| 0.936111111111111 | 0 |
| 0.9368055555555556 | 0 |
| 0.9375 | 0 |
| 0.9381944444444444 | 0 |
| 0.938888888888889 | 0 |
| 0.9395833333333333 | 0 |
| 0.9402777777777778 | 0 |
| 0.9409722222222222 | 0 |
| 0.9416666666666668 | 0 |
| 0.9423611111111111 | 0 |
| 0.9430555555555555 | 0 |
| 0.94375 | 0 |
| 0.9444444444444445 | 0 |
| 0.9451388888888889 | 0 |
| 0.9458333333333333 | 0 |
| 0.9465277777777777 | 0 |
| 0.9472222222222223 | 0 |
| 0.9479166666666666 | 0 |
| 0.9486111111111111 | 0 |
| 0.9493055555555556 | 0 |
| 0.9500000000000001 | 0 |
| 0.9506944444444444 | 0 |
| 0.9513888888888888 | 0 |
| 0.9520833333333334 | 0 |
| 0.9527777777777778 | 0 |
| 0.9534722222222222 | 0 |
| 0.9541666666666666 | 0 |
| 0.9548611111111112 | 0 |
| 0.9555555555555556 | 0 |
| 0.9562499999999999 | 0 |
| 0.9569444444444444 | 0 |
| 0.9576388888888889 | 0 |
| 0.9583333333333334 | 0 |
| 0.9590277777777777 | 0 |
| 0.9597222222222223 | 0 |
| 0.9604166666666667 | 0 |
| 0.9611111111111111 | 0 |
| 0.9618055555555555 | 0 |
| 0.9625 | 0 |
| 0.9631944444444445 | 0 |
| 0.9638888888888889 | 0 |
| 0.9645833333333332 | 0 |
| 0.9652777777777778 | 0 |
| 0.9659722222222222 | 0 |
| 0.9666666666666667 | 0 |
| 0.967361111111111 | 0 |
| 0.9680555555555556 | 0 |
| 0.96875 | 0 |
| 0.9694444444444444 | 0 |
| 0.970138888888889 | 0 |
| 0.9708333333333333 | 0 |
| 0.9715277777777778 | 0 |
| 0.9722222222222222 | 0 |
| 0.9729166666666668 | 0 |
| 0.9736111111111111 | 0 |
| 0.9743055555555555 | 0 |
| 0.975 | 0 |
| 0.9756944444444445 | 0 |
| 0.9763888888888889 | 0 |
| 0.9770833333333333 | 0 |
| 0.9777777777777777 | 0 |
| 0.9784722222222223 | 0 |
| 0.9791666666666666 | 0 |
| 0.9798611111111111 | 0 |
| 0.9805555555555556 | 0 |
| 0.9812500000000001 | 0 |
| 0.9819444444444444 | 0 |
| 0.9826388888888888 | 0 |
| 0.9833333333333334 | 0 |
| 0.9840277777777778 | 0 |
| 0.9847222222222222 | 0 |
| 0.9854166666666666 | 0 |
| 0.9861111111111112 | 0 |
| 0.9868055555555556 | 0 |
| 0.9874999999999999 | 0 |
| 0.9881944444444444 | 0 |
| 0.9888888888888889 | 0 |
| 0.9895833333333334 | 0 |
| 0.9902777777777777 | 0 |
| 0.9909722222222223 | 0 |
| 0.9916666666666667 | 0 |
| 0.9923611111111111 | 0 |
| 0.9930555555555555 | 0 |
| 0.99375 | 0 |
| 0.9944444444444445 | 0 |
| 0.9951388888888889 | 0 |
| 0.9958333333333332 | 0 |
| 0.9965277777777778 | 0 |
| 0.9972222222222222 | 0 |
| 0.9979166666666667 | 0 |
| 0.998611111111111 | 0 |
| 0.9993055555555556 | 0 |